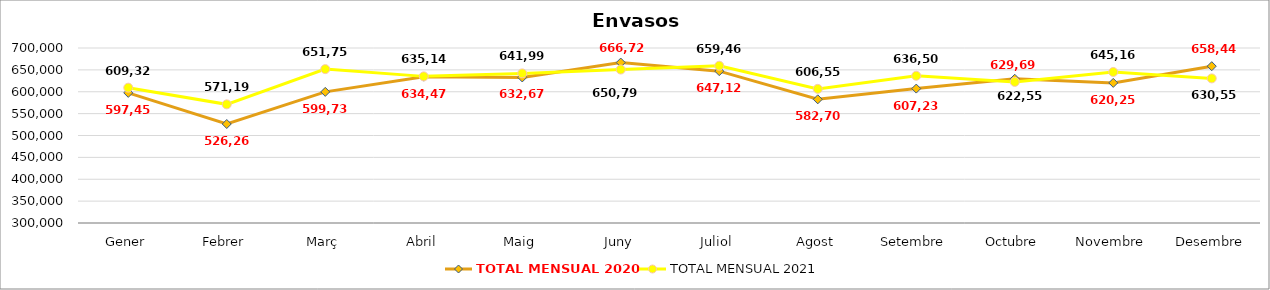
| Category | TOTAL MENSUAL 2020 | TOTAL MENSUAL 2021 |
|---|---|---|
| Gener | 597449.86 | 609328.23 |
| Febrer | 526267.4 | 571196.96 |
| Març | 599738.14 | 651751.22 |
| Abril | 634469.56 | 635148.76 |
| Maig | 632674 | 641992.6 |
| Juny | 666724.92 | 650793.76 |
| Juliol | 647125.47 | 659463.04 |
| Agost | 582707.69 | 606557.3 |
| Setembre | 607231.67 | 636501.05 |
| Octubre | 629693.61 | 622553.81 |
| Novembre | 620253.68 | 645165.98 |
| Desembre | 658440.01 | 630556 |